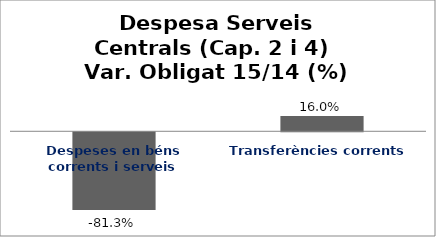
| Category | Series 0 |
|---|---|
| Despeses en béns corrents i serveis | -0.813 |
| Transferències corrents | 0.16 |